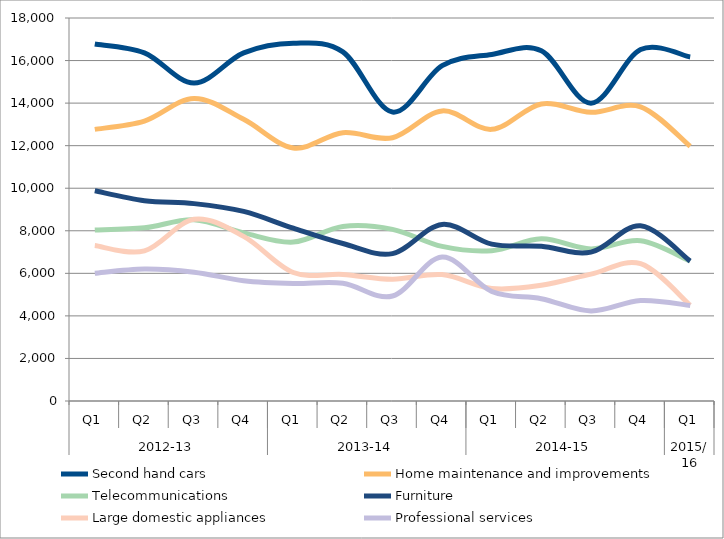
| Category | Second hand cars | Home maintenance and improvements | Telecommunications | Furniture | Large domestic appliances | Professional services |
|---|---|---|---|---|---|---|
| 0 | 16777 | 12767 | 8035 | 9881 | 7303 | 6006 |
| 1 | 16363 | 13154 | 8139 | 9414 | 7054 | 6205 |
| 2 | 14945 | 14221 | 8516 | 9276 | 8540 | 6054 |
| 3 | 16361 | 13238 | 7902 | 8910 | 7736 | 5654 |
| 4 | 16812 | 11894 | 7469 | 8123 | 6039 | 5523 |
| 5 | 16408 | 12610 | 8203 | 7401 | 5948 | 5534 |
| 6 | 13579 | 12375 | 8068 | 6927 | 5723 | 4933 |
| 7 | 15758 | 13634 | 7265 | 8299 | 5941 | 6765 |
| 8 | 16289 | 12767 | 7066 | 7372 | 5291 | 5148 |
| 9 | 16456 | 13961 | 7620 | 7271 | 5439 | 4808 |
| 10 | 13995 | 13566 | 7149 | 6996 | 5961 | 4231 |
| 11 | 16517 | 13828 | 7531 | 8232 | 6453 | 4722 |
| 12 | 16167 | 11969 | 6577 | 6574 | 4499 | 4488 |